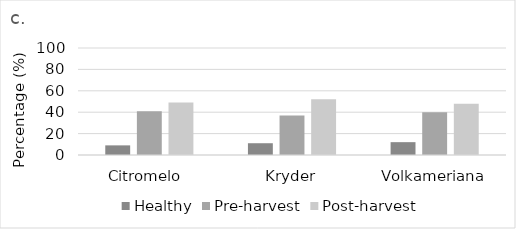
| Category | Healthy | Pre-harvest | Post-harvest |
|---|---|---|---|
| Citromelo  | 9 | 41 | 49 |
| Kryder | 11 | 37 | 52 |
| Volkameriana | 12 | 40 | 48 |